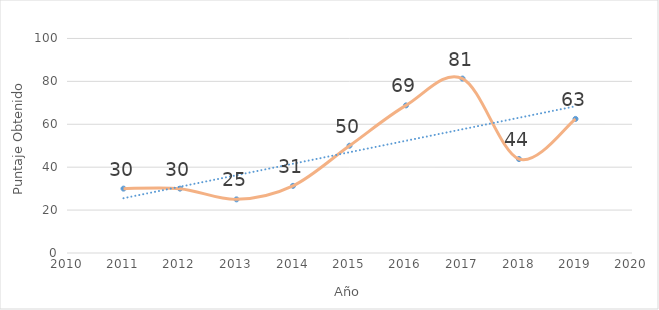
| Category | Tecnologías de la información |
|---|---|
| 2011.0 | 30 |
| 2012.0 | 30 |
| 2013.0 | 25 |
| 2014.0 | 31.3 |
| 2015.0 | 50 |
| 2016.0 | 68.8 |
| 2017.0 | 81.3 |
| 2018.0 | 43.8 |
| 2019.0 | 62.5 |